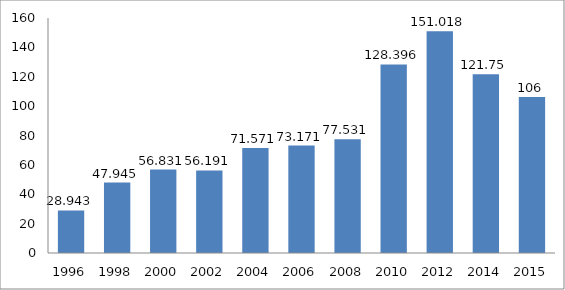
| Category | Series 0 |
|---|---|
| 1996.0 | 28.943 |
| 1998.0 | 47.945 |
| 2000.0 | 56.831 |
| 2002.0 | 56.191 |
| 2004.0 | 71.571 |
| 2006.0 | 73.171 |
| 2008.0 | 77.531 |
| 2010.0 | 128.396 |
| 2012.0 | 151.018 |
| 2014.0 | 121.75 |
| 2015.0 | 106.193 |